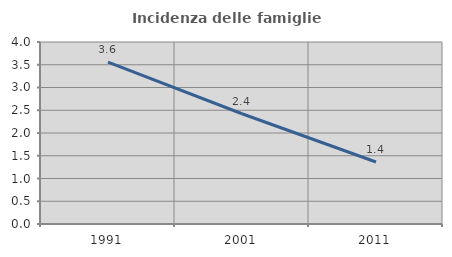
| Category | Incidenza delle famiglie numerose |
|---|---|
| 1991.0 | 3.559 |
| 2001.0 | 2.423 |
| 2011.0 | 1.363 |